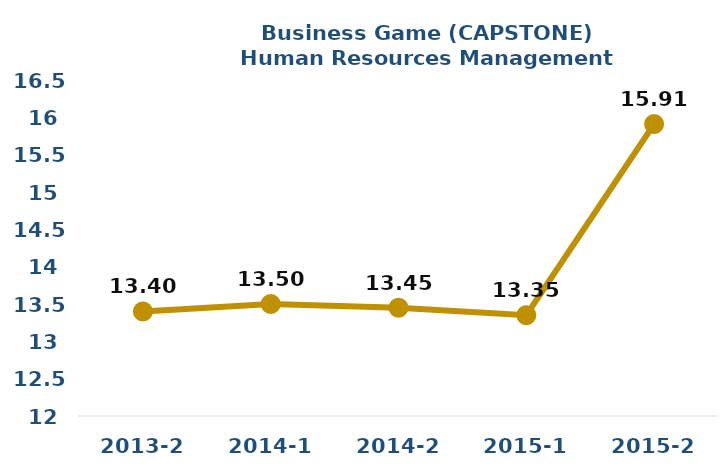
| Category | Series 0 |
|---|---|
| 2013-2 | 13.4 |
| 2014-1 | 13.5 |
| 2014-2 | 13.45 |
| 2015-1 | 13.35 |
| 2015-2 | 15.91 |